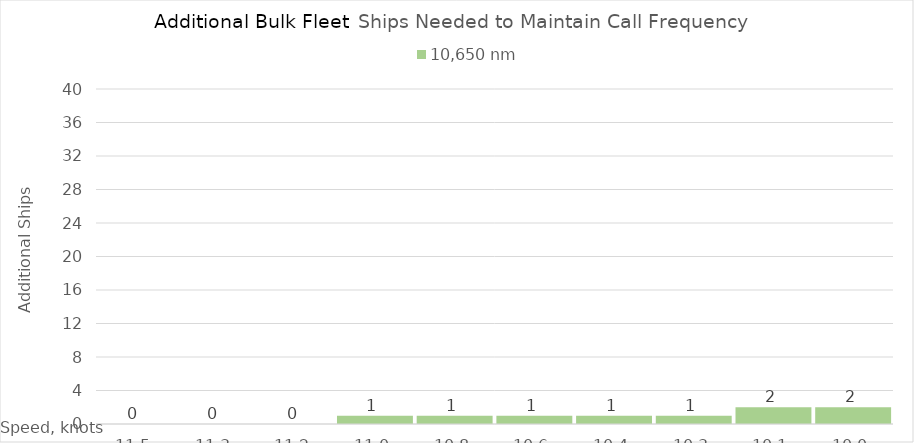
| Category | 10,650 |
|---|---|
| 11.52 | 0 |
| 11.34 | 0 |
| 11.16 | 0 |
| 10.98 | 1 |
| 10.8 | 1 |
| 10.620000000000001 | 1 |
| 10.440000000000001 | 1 |
| 10.260000000000002 | 1 |
| 10.080000000000002 | 2 |
| 10.0 | 2 |